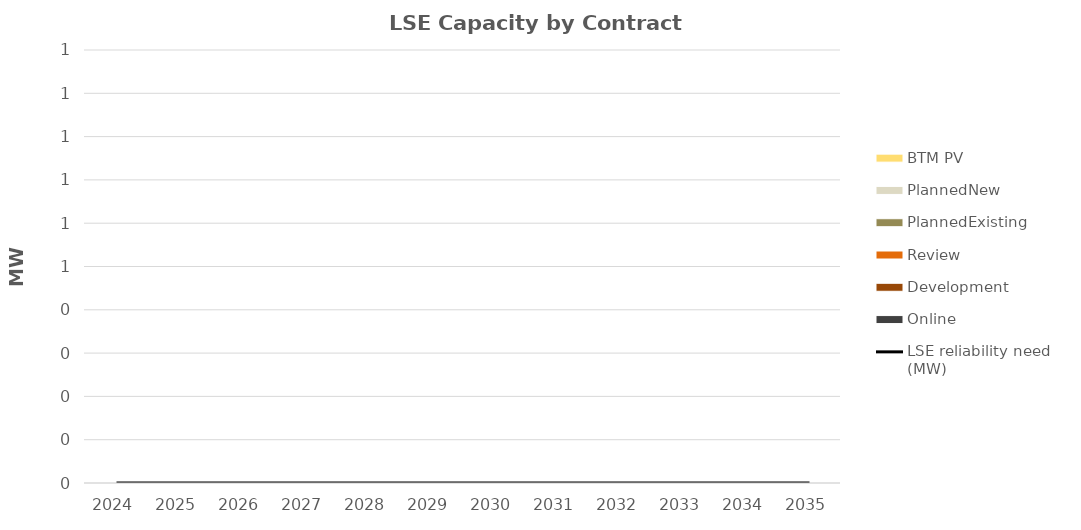
| Category | Online | Development | Review | PlannedExisting | PlannedNew | BTM PV |
|---|---|---|---|---|---|---|
| 2024.0 | 0 | 0 | 0 | 0 | 0 | 0 |
| 2025.0 | 0 | 0 | 0 | 0 | 0 | 0 |
| 2026.0 | 0 | 0 | 0 | 0 | 0 | 0 |
| 2027.0 | 0 | 0 | 0 | 0 | 0 | 0 |
| 2028.0 | 0 | 0 | 0 | 0 | 0 | 0 |
| 2029.0 | 0 | 0 | 0 | 0 | 0 | 0 |
| 2030.0 | 0 | 0 | 0 | 0 | 0 | 0 |
| 2031.0 | 0 | 0 | 0 | 0 | 0 | 0 |
| 2032.0 | 0 | 0 | 0 | 0 | 0 | 0 |
| 2033.0 | 0 | 0 | 0 | 0 | 0 | 0 |
| 2034.0 | 0 | 0 | 0 | 0 | 0 | 0 |
| 2035.0 | 0 | 0 | 0 | 0 | 0 | 0 |